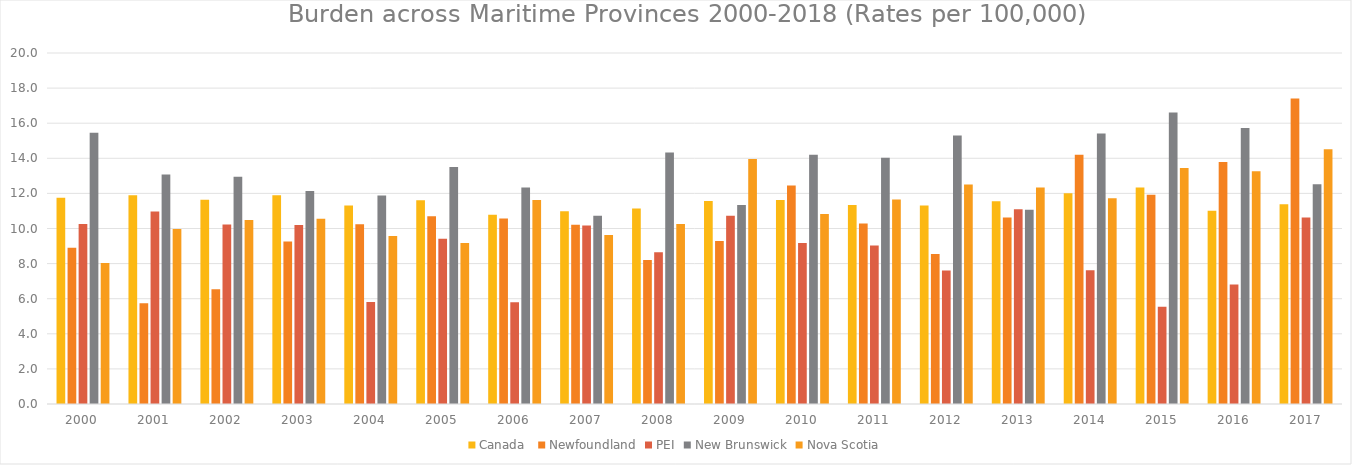
| Category | Canada  | Newfoundland | PEI | New Brunswick | Nova Scotia |
|---|---|---|---|---|---|
| 2000.0 | 11.751 | 8.902 | 10.259 | 15.456 | 8.032 |
| 2001.0 | 11.902 | 5.747 | 10.976 | 13.07 | 9.973 |
| 2002.0 | 11.639 | 6.545 | 10.228 | 12.944 | 10.479 |
| 2003.0 | 11.898 | 9.258 | 10.202 | 12.142 | 10.558 |
| 2004.0 | 11.312 | 10.243 | 5.811 | 11.876 | 9.578 |
| 2005.0 | 11.608 | 10.693 | 9.416 | 13.502 | 9.169 |
| 2006.0 | 10.783 | 10.576 | 5.803 | 12.339 | 11.622 |
| 2007.0 | 10.979 | 10.215 | 10.166 | 10.732 | 9.624 |
| 2008.0 | 11.144 | 8.21 | 8.649 | 14.326 | 10.258 |
| 2009.0 | 11.567 | 9.289 | 10.723 | 11.334 | 13.963 |
| 2010.0 | 11.619 | 12.452 | 9.177 | 14.209 | 10.827 |
| 2011.0 | 11.346 | 10.286 | 9.03 | 14.027 | 11.649 |
| 2012.0 | 11.309 | 8.55 | 7.611 | 15.296 | 12.505 |
| 2013.0 | 11.555 | 10.624 | 11.104 | 11.074 | 12.335 |
| 2014.0 | 12.004 | 14.2 | 7.624 | 15.416 | 11.72 |
| 2015.0 | 12.338 | 11.929 | 5.535 | 16.604 | 13.454 |
| 2016.0 | 11.016 | 13.789 | 6.804 | 15.72 | 13.259 |
| 2017.0 | 11.376 | 17.406 | 10.627 | 12.519 | 14.516 |